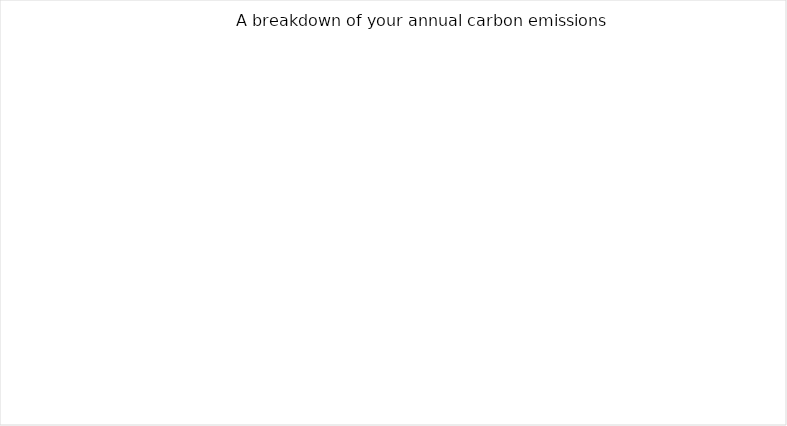
| Category | Series 0 |
|---|---|
|   | 0 |
|   | 0 |
|   | 0 |
|   | 0 |
|   | 0 |
|   | 0 |
|   | 0 |
|   | 0 |
|   | 0 |
|   | 0 |
|   | 0 |
|   | 0 |